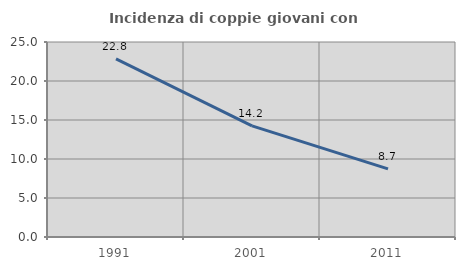
| Category | Incidenza di coppie giovani con figli |
|---|---|
| 1991.0 | 22.848 |
| 2001.0 | 14.244 |
| 2011.0 | 8.737 |